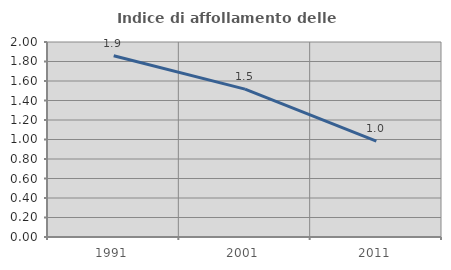
| Category | Indice di affollamento delle abitazioni  |
|---|---|
| 1991.0 | 1.859 |
| 2001.0 | 1.517 |
| 2011.0 | 0.984 |